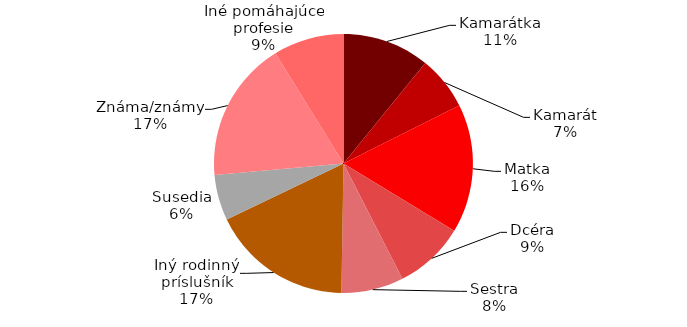
| Category | Series 0 |
|---|---|
| Kamarátka | 21 |
| Kamarát | 13 |
| Matka | 31 |
| Dcéra | 17 |
| Sestra | 15 |
| Iný rodinný príslušník | 34 |
| Susedia | 11 |
| Známa/známy | 34 |
| Iné pomáhajúce profesie | 17 |